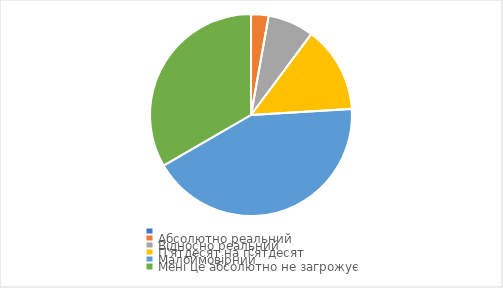
| Category | 25 років або старші |
|---|---|
|  | 0 |
| Абсолютно реальний | 0.028 |
| Відносно реальний | 0.074 |
| П'ятдесят на п'ятдесят | 0.139 |
| Малоймовірний | 0.426 |
| Мені це абсолютно не загрожує | 0.334 |